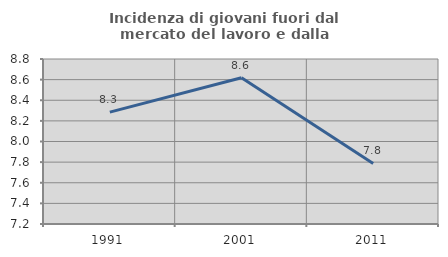
| Category | Incidenza di giovani fuori dal mercato del lavoro e dalla formazione  |
|---|---|
| 1991.0 | 8.285 |
| 2001.0 | 8.618 |
| 2011.0 | 7.787 |